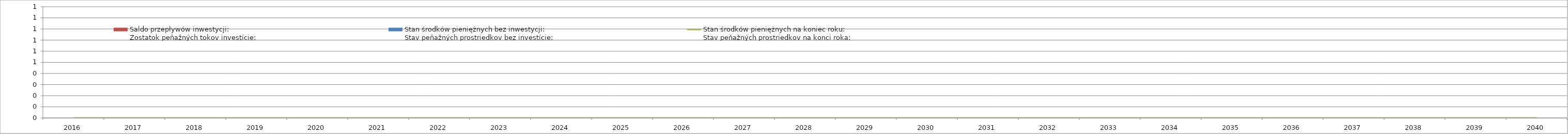
| Category | Stan środków pieniężnych bez inwestycji:
Stav peňažných prostriedkov bez investície: | Saldo przepływów inwestycji:
Zostatok peňažných tokov investície: |
|---|---|---|
| 2016.0 | 0 | 0 |
| 2017.0 | 0 | 0 |
| 2018.0 | 0 | 0 |
| 2019.0 | 0 | 0 |
| 2020.0 | 0 | 0 |
| 2021.0 | 0 | 0 |
| 2022.0 | 0 | 0 |
| 2023.0 | 0 | 0 |
| 2024.0 | 0 | 0 |
| 2025.0 | 0 | 0 |
| 2026.0 | 0 | 0 |
| 2027.0 | 0 | 0 |
| 2028.0 | 0 | 0 |
| 2029.0 | 0 | 0 |
| 2030.0 | 0 | 0 |
| 2031.0 | 0 | 0 |
| 2032.0 | 0 | 0 |
| 2033.0 | 0 | 0 |
| 2034.0 | 0 | 0 |
| 2035.0 | 0 | 0 |
| 2036.0 | 0 | 0 |
| 2037.0 | 0 | 0 |
| 2038.0 | 0 | 0 |
| 2039.0 | 0 | 0 |
| 2040.0 | 0 | 0 |